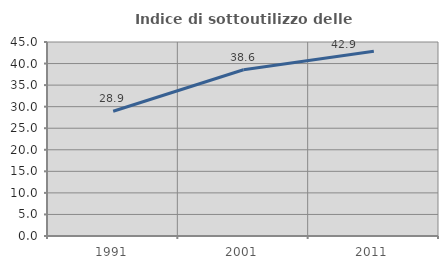
| Category | Indice di sottoutilizzo delle abitazioni  |
|---|---|
| 1991.0 | 28.931 |
| 2001.0 | 38.564 |
| 2011.0 | 42.857 |